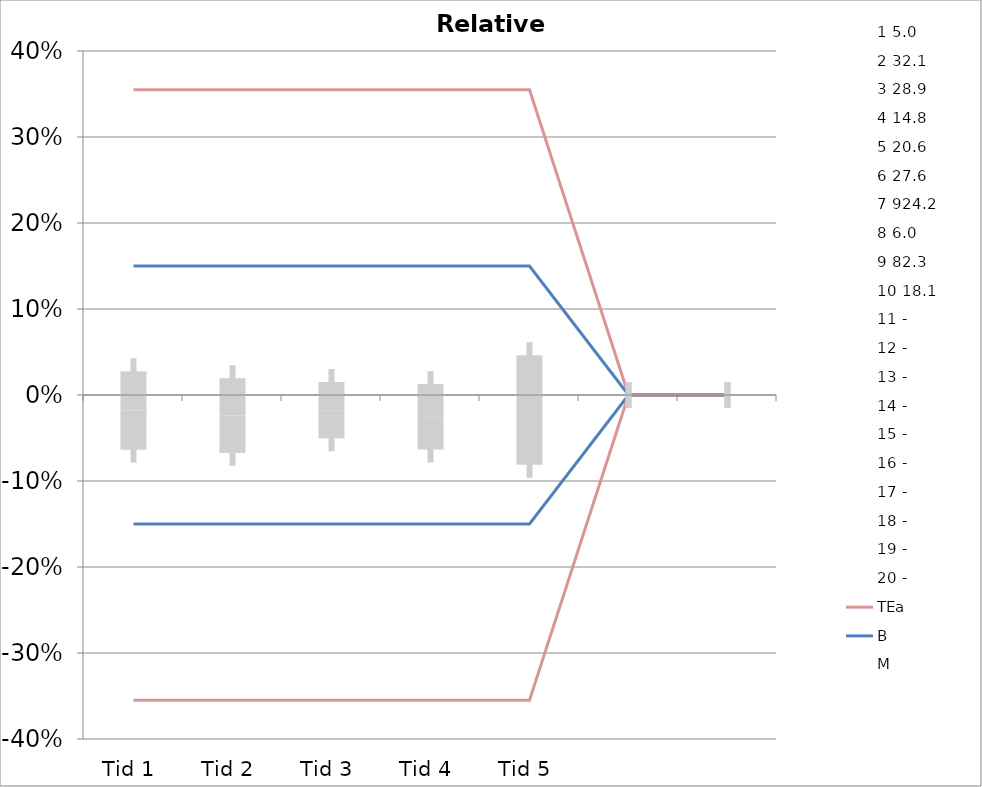
| Category | 1 | 2 | 3 | 4 | 5 | 6 | 7 | 8 | 9 | 10 | 11 | 12 | 13 | 14 | 15 | 16 | 17 | 18 | 19 | 20 | TEa | B | -B | -TEa | M |
|---|---|---|---|---|---|---|---|---|---|---|---|---|---|---|---|---|---|---|---|---|---|---|---|---|---|
| Tid 1 | -0.06 | 0.134 | -0.021 | 0.041 | -0.058 | -0.029 | -0.035 | -0.033 | -0.096 | -0.022 | 0 | 0 | 0 | 0 | 0 | 0 | 0 | 0 | 0 | 0 | 0.355 | 0.15 | -0.15 | -0.355 | -0.018 |
| Tid 2 | -0.06 | 0.028 | 0.024 | 0.095 | -0.034 | -0.04 | -0.016 | -0.033 | -0.086 | -0.116 | 0 | 0 | 0 | 0 | 0 | 0 | 0 | 0 | 0 | 0 | 0.355 | 0.15 | -0.15 | -0.355 | -0.024 |
| Tid 3 | -0.04 | 0.047 | 0.003 | 0.061 | -0.058 | -0.062 | -0.011 | 0 | -0.045 | -0.072 | 0 | 0 | 0 | 0 | 0 | 0 | 0 | 0 | 0 | 0 | 0.355 | 0.15 | -0.15 | -0.355 | -0.018 |
| Tid 4 | 0.02 | 0 | -0.014 | 0.054 | -0.053 | -0.072 | -0.013 | 0 | -0.069 | -0.055 | 0 | 0 | 0 | 0 | 0 | 0 | 0 | 0 | 0 | 0 | 0.355 | 0.15 | -0.15 | -0.355 | -0.025 |
| Tid 5 | 0.04 | 0 | -0.024 | 0.115 | -0.024 | -0.036 | 0.013 | 0 | -0.09 | -0.133 | 0 | 0 | 0 | 0 | 0 | 0 | 0 | 0 | 0 | 0 | 0.355 | 0.15 | -0.15 | -0.355 | -0.017 |